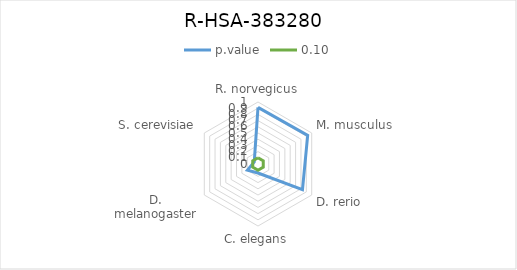
| Category | p.value | 0.10 |
|---|---|---|
| R. norvegicus | 0.913 | 0.1 |
| M. musculus | 0.925 | 0.1 |
| D. rerio | 0.828 | 0.1 |
| C. elegans | 0.145 | 0.1 |
| D. melanogaster | 0.197 | 0.1 |
| S. cerevisiae | 0.07 | 0.1 |